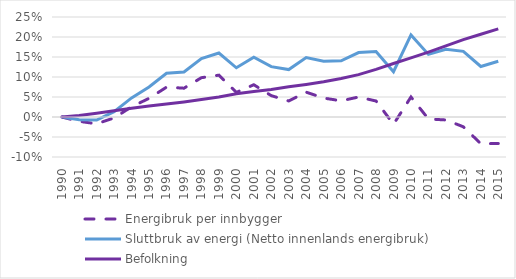
| Category | Energibruk per innbygger | Sluttbruk av energi (Netto innenlands energibruk) | Befolkning |
|---|---|---|---|
| 1990.0 | 0 | 0 | 0 |
| 1991.0 | -0.011 | -0.007 | 0.004 |
| 1992.0 | -0.017 | -0.008 | 0.01 |
| 1993.0 | -0.002 | 0.013 | 0.016 |
| 1994.0 | 0.026 | 0.048 | 0.022 |
| 1995.0 | 0.047 | 0.075 | 0.027 |
| 1996.0 | 0.075 | 0.109 | 0.032 |
| 1997.0 | 0.072 | 0.112 | 0.038 |
| 1998.0 | 0.098 | 0.146 | 0.044 |
| 1999.0 | 0.105 | 0.16 | 0.05 |
| 2000.0 | 0.062 | 0.123 | 0.058 |
| 2001.0 | 0.081 | 0.15 | 0.064 |
| 2002.0 | 0.053 | 0.126 | 0.069 |
| 2003.0 | 0.04 | 0.119 | 0.075 |
| 2004.0 | 0.062 | 0.148 | 0.081 |
| 2005.0 | 0.047 | 0.14 | 0.088 |
| 2006.0 | 0.04 | 0.141 | 0.096 |
| 2007.0 | 0.05 | 0.161 | 0.106 |
| 2008.0 | 0.04 | 0.164 | 0.119 |
| 2009.0 | -0.018 | 0.113 | 0.134 |
| 2010.0 | 0.05 | 0.205 | 0.148 |
| 2011.0 | -0.005 | 0.157 | 0.162 |
| 2012.0 | -0.007 | 0.169 | 0.178 |
| 2013.0 | -0.024 | 0.164 | 0.193 |
| 2014.0 | -0.067 | 0.126 | 0.207 |
| 2015.0 | -0.066 | 0.139 | 0.22 |